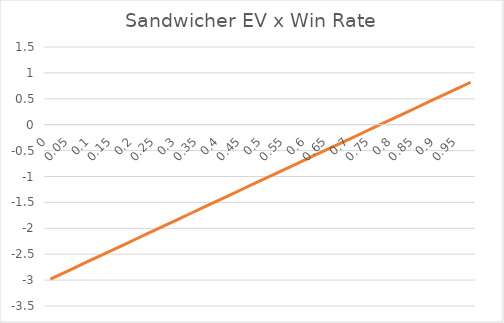
| Category | (dRate/dVlm) |
|---|---|
| 0.0 | -2.981 |
| 0.025 | -2.884 |
| 0.05 | -2.786 |
| 0.07500000000000001 | -2.689 |
| 0.1 | -2.591 |
| 0.125 | -2.494 |
| 0.15 | -2.396 |
| 0.175 | -2.299 |
| 0.19999999999999998 | -2.202 |
| 0.22499999999999998 | -2.104 |
| 0.24999999999999997 | -2.007 |
| 0.27499999999999997 | -1.909 |
| 0.3 | -1.812 |
| 0.325 | -1.714 |
| 0.35000000000000003 | -1.617 |
| 0.37500000000000006 | -1.519 |
| 0.4000000000000001 | -1.422 |
| 0.4250000000000001 | -1.324 |
| 0.4500000000000001 | -1.227 |
| 0.47500000000000014 | -1.13 |
| 0.5000000000000001 | -1.032 |
| 0.5250000000000001 | -0.935 |
| 0.5500000000000002 | -0.837 |
| 0.5750000000000002 | -0.74 |
| 0.6000000000000002 | -0.642 |
| 0.6250000000000002 | -0.545 |
| 0.6500000000000002 | -0.447 |
| 0.6750000000000003 | -0.35 |
| 0.7000000000000003 | -0.253 |
| 0.7250000000000003 | -0.155 |
| 0.7500000000000003 | -0.058 |
| 0.7750000000000004 | 0.04 |
| 0.8000000000000004 | 0.137 |
| 0.8250000000000004 | 0.235 |
| 0.8500000000000004 | 0.332 |
| 0.8750000000000004 | 0.43 |
| 0.9000000000000005 | 0.527 |
| 0.9250000000000005 | 0.624 |
| 0.9500000000000005 | 0.722 |
| 0.9750000000000005 | 0.819 |